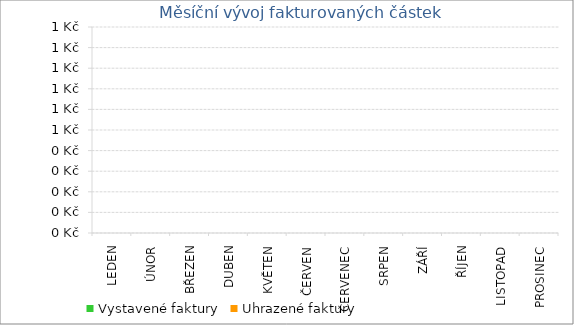
| Category | Vystavené faktury | Uhrazené faktury |
|---|---|---|
| LEDEN | 0 | 0 |
| ÚNOR | 0 | 0 |
| BŘEZEN | 0 | 0 |
| DUBEN | 0 | 0 |
| KVĚTEN | 0 | 0 |
| ČERVEN | 0 | 0 |
| ČERVENEC | 0 | 0 |
| SRPEN | 0 | 0 |
| ZÁŘÍ | 0 | 0 |
| ŘÍJEN | 0 | 0 |
| LISTOPAD | 0 | 0 |
| PROSINEC | 0 | 0 |